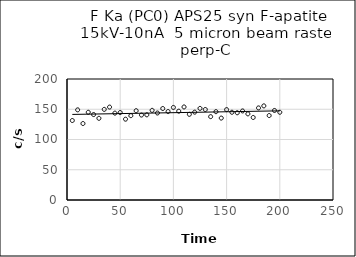
| Category | Series 0 |
|---|---|
| 5.0 | 131.4 |
| 10.0 | 149 |
| 15.0 | 126.4 |
| 20.0 | 145 |
| 25.0 | 141.2 |
| 30.0 | 135 |
| 35.0 | 149.8 |
| 40.0 | 153.6 |
| 45.0 | 143.6 |
| 50.0 | 144.6 |
| 55.0 | 133.6 |
| 60.0 | 139.4 |
| 65.0 | 147.6 |
| 70.0 | 140.4 |
| 75.0 | 140.8 |
| 80.0 | 148.2 |
| 85.0 | 143.8 |
| 90.0 | 151.2 |
| 95.0 | 146.2 |
| 100.0 | 153 |
| 105.0 | 146.8 |
| 110.0 | 153.8 |
| 115.0 | 141.6 |
| 120.0 | 145.2 |
| 125.0 | 151.4 |
| 130.0 | 149.6 |
| 135.0 | 137.8 |
| 140.0 | 146 |
| 145.0 | 135.4 |
| 150.0 | 149.4 |
| 155.0 | 145 |
| 160.0 | 144.2 |
| 165.0 | 147.2 |
| 170.0 | 142.4 |
| 175.0 | 136.4 |
| 180.0 | 152.2 |
| 185.0 | 155.6 |
| 190.0 | 139.6 |
| 195.0 | 148 |
| 200.0 | 145 |